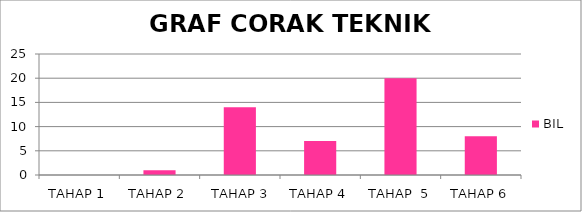
| Category | BIL |
|---|---|
| TAHAP 1 | 0 |
| TAHAP 2 | 1 |
|  TAHAP 3 | 14 |
| TAHAP 4 | 7 |
| TAHAP  5 | 20 |
| TAHAP 6 | 8 |